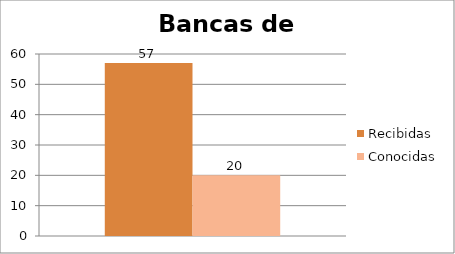
| Category | Recibidas | Conocidas |
|---|---|---|
| 0 | 57 | 20 |